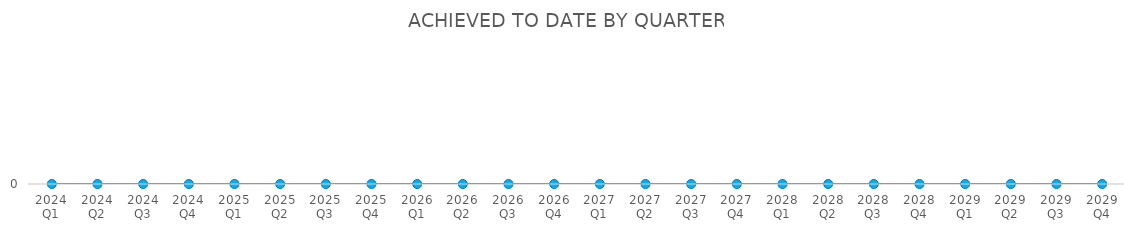
| Category | ACHIEVED TO DATE |
|---|---|
| 2024 Q1 | 0 |
| 2024 Q2 | 0 |
| 2024 Q3 | 0 |
| 2024 Q4 | 0 |
| 2025 Q1 | 0 |
| 2025 Q2 | 0 |
| 2025 Q3 | 0 |
| 2025 Q4 | 0 |
| 2026 Q1 | 0 |
| 2026 Q2 | 0 |
| 2026 Q3 | 0 |
| 2026 Q4 | 0 |
| 2027 Q1 | 0 |
| 2027 Q2 | 0 |
| 2027 Q3 | 0 |
| 2027 Q4 | 0 |
| 2028 Q1 | 0 |
| 2028 Q2 | 0 |
| 2028 Q3 | 0 |
| 2028 Q4 | 0 |
| 2029 Q1 | 0 |
| 2029 Q2 | 0 |
| 2029 Q3 | 0 |
| 2029 Q4 | 0 |